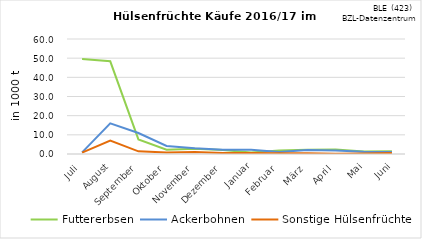
| Category | Futtererbsen | Ackerbohnen | Sonstige Hülsenfrüchte |
|---|---|---|---|
| Juli | 49.523 | 0.836 | 0.746 |
| August | 48.366 | 16.018 | 7.035 |
| September | 7.591 | 10.952 | 1.393 |
| Oktober | 2.187 | 4.213 | 0.79 |
| November | 2.719 | 3.023 | 1.083 |
| Dezember | 2.101 | 2.277 | 0.492 |
| Januar | 0.844 | 2.194 | 0.487 |
| Februar | 1.856 | 1.104 | 0.337 |
| März | 2.156 | 2.056 | 0.353 |
| April | 2.295 | 1.861 | 0.168 |
| Mai | 1.352 | 1.203 | 0.253 |
| Juni | 1.434 | 1.087 | 0.495 |